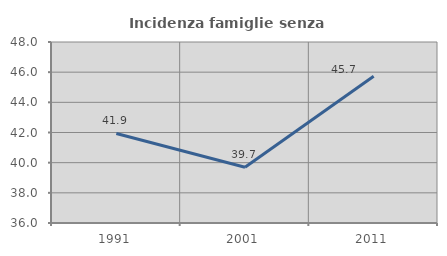
| Category | Incidenza famiglie senza nuclei |
|---|---|
| 1991.0 | 41.935 |
| 2001.0 | 39.695 |
| 2011.0 | 45.724 |